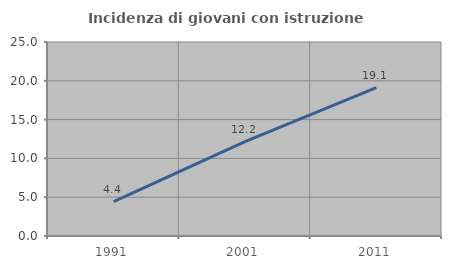
| Category | Incidenza di giovani con istruzione universitaria |
|---|---|
| 1991.0 | 4.43 |
| 2001.0 | 12.162 |
| 2011.0 | 19.118 |